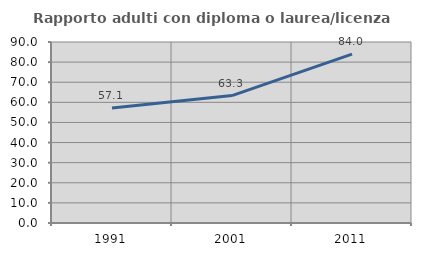
| Category | Rapporto adulti con diploma o laurea/licenza media  |
|---|---|
| 1991.0 | 57.143 |
| 2001.0 | 63.347 |
| 2011.0 | 84.009 |